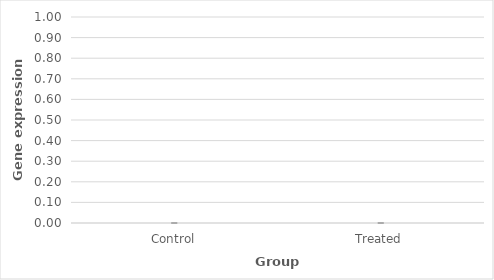
| Category | Series 0 |
|---|---|
| Control | 0 |
| Treated | 0 |